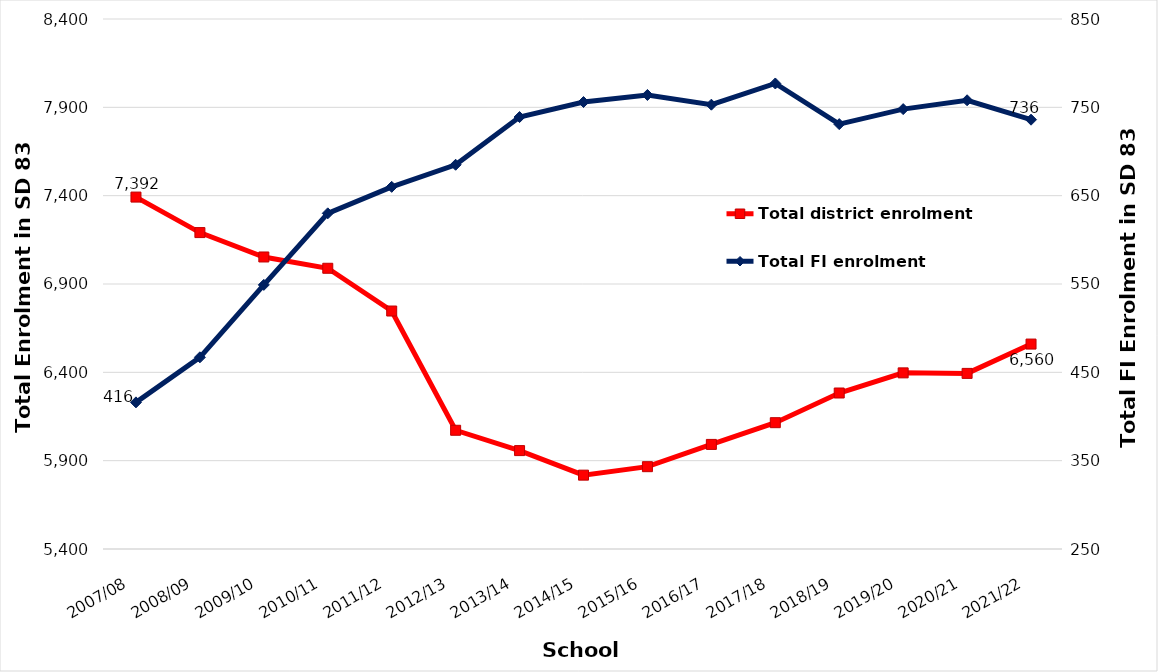
| Category | Total district enrolment  |
|---|---|
| 2007/08 | 7392 |
| 2008/09 | 7191 |
| 2009/10 | 7053 |
| 2010/11 | 6989 |
| 2011/12 | 6747 |
| 2012/13 | 6072 |
| 2013/14 | 5957 |
| 2014/15 | 5818 |
| 2015/16 | 5866 |
| 2016/17 | 5992 |
| 2017/18 | 6115 |
| 2018/19 | 6283 |
| 2019/20 | 6397 |
| 2020/21 | 6394 |
| 2021/22 | 6560 |